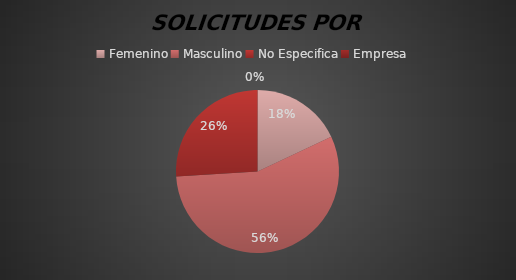
| Category | Series 0 |
|---|---|
| Femenino | 9 |
| Masculino | 28 |
| No Especifica | 13 |
| Empresa | 0 |